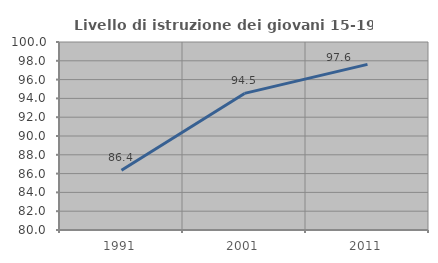
| Category | Livello di istruzione dei giovani 15-19 anni |
|---|---|
| 1991.0 | 86.364 |
| 2001.0 | 94.531 |
| 2011.0 | 97.619 |